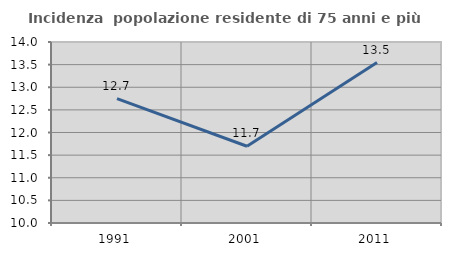
| Category | Incidenza  popolazione residente di 75 anni e più |
|---|---|
| 1991.0 | 12.749 |
| 2001.0 | 11.696 |
| 2011.0 | 13.545 |